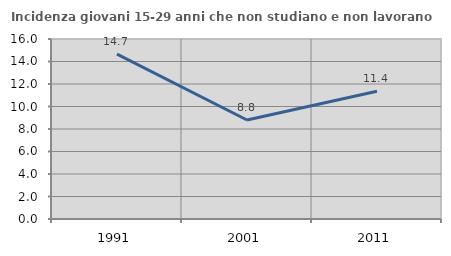
| Category | Incidenza giovani 15-29 anni che non studiano e non lavorano  |
|---|---|
| 1991.0 | 14.651 |
| 2001.0 | 8.797 |
| 2011.0 | 11.359 |